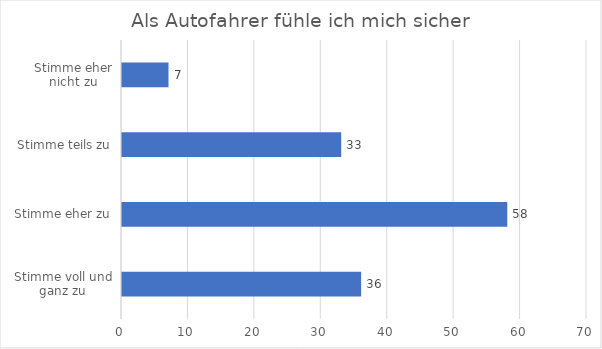
| Category | Series 0 |
|---|---|
| Stimme voll und ganz zu | 36 |
| Stimme eher zu | 58 |
| Stimme teils zu | 33 |
| Stimme eher nicht zu | 7 |